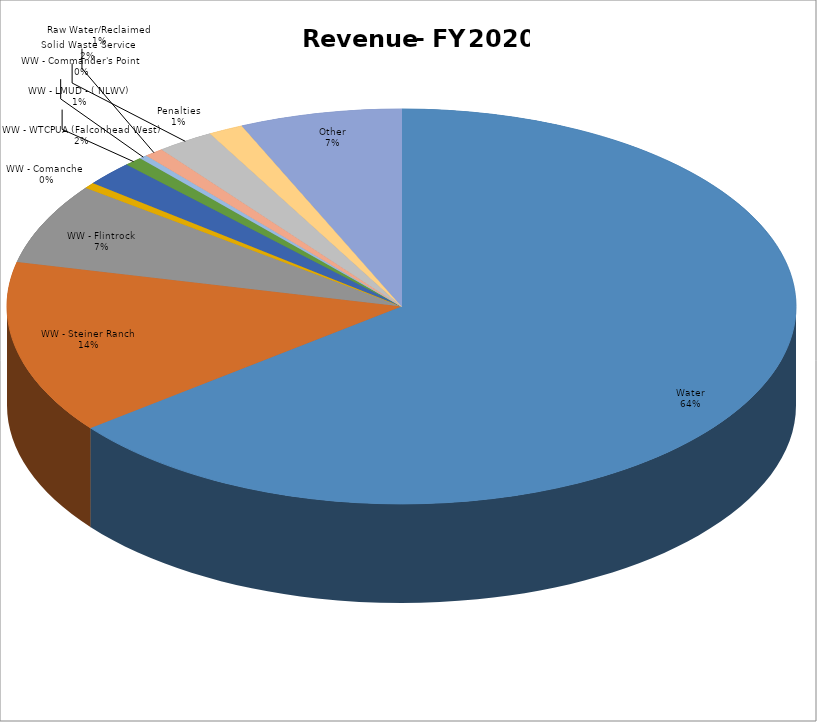
| Category | Series 0 | Series 1 |
|---|---|---|
| Water | 12951700 | 0.644 |
| WW - Steiner Ranch | 2850600 | 0.142 |
| WW - Flintrock | 1330000 | 0.066 |
| WW - Comanche  | 98800 | 0.005 |
| WW - WTCPUA (Falconhead West) | 403750 | 0.02 |
| WW - LMUD - ( NLWV) | 151050 | 0.008 |
| WW - Commander's Point | 64000 | 0.003 |
| Raw Water/Reclaimed | 160500 | 0.008 |
| Solid Waste Service | 468200 | 0.023 |
| Penalties | 288600 | 0.014 |
| Other | 1333000 | 0.066 |